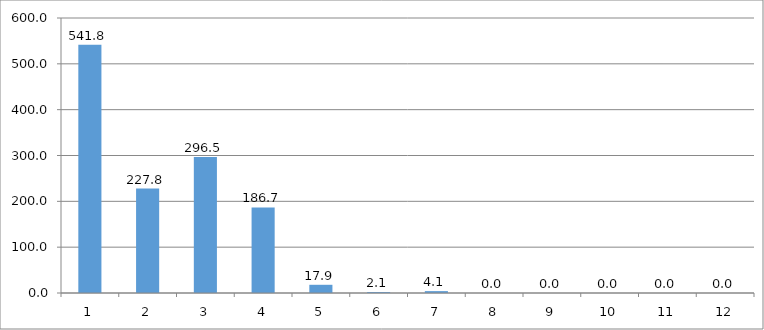
| Category | Series 0 |
|---|---|
| 0 | 541.8 |
| 1 | 227.8 |
| 2 | 296.5 |
| 3 | 186.7 |
| 4 | 17.9 |
| 5 | 2.1 |
| 6 | 4.1 |
| 7 | 0 |
| 8 | 0 |
| 9 | 0 |
| 10 | 0 |
| 11 | 0 |